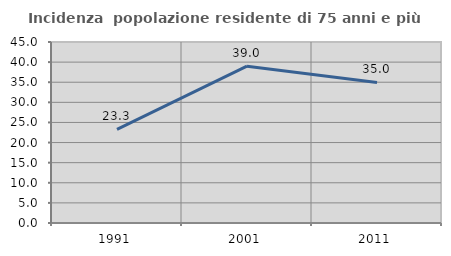
| Category | Incidenza  popolazione residente di 75 anni e più |
|---|---|
| 1991.0 | 23.265 |
| 2001.0 | 38.994 |
| 2011.0 | 34.951 |